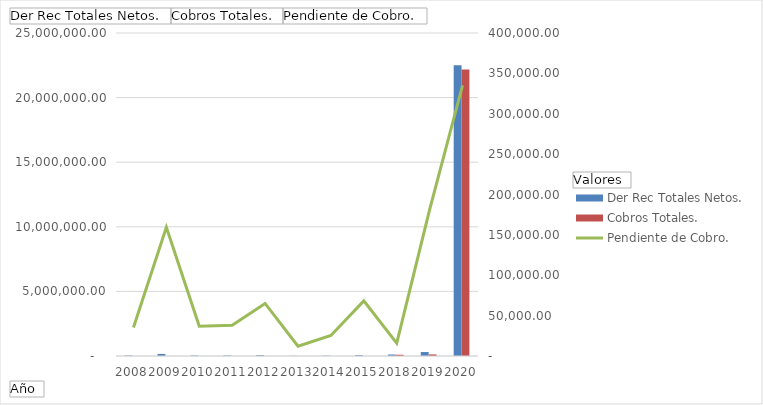
| Category | Der Rec Totales Netos. | Cobros Totales. |
|---|---|---|
| 2008 | 35331.75 | 0 |
| 2009 | 159500 | 0 |
| 2010 | 36800 | 0 |
| 2011 | 37934.99 | 0 |
| 2012 | 65127.9 | 0 |
| 2013 | 12198.76 | 0 |
| 2014 | 25474.58 | 0 |
| 2015 | 68270.41 | 0 |
| 2018 | 114811.23 | 98911.23 |
| 2019 | 305597.74 | 124285.59 |
| 2020 | 22510134.32 | 22175043.22 |